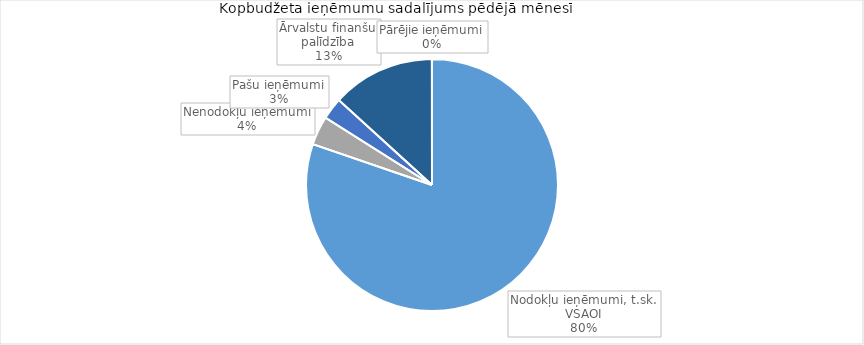
| Category | Series 0 |
|---|---|
| Nodokļu ieņēmumi, t.sk. VSAOI | 1107409.079 |
| Nenodokļu ieņēmumi | 51171.359 |
| Pašu ieņēmumi | 38661.189 |
| Ārvalstu finanšu palīdzība | 182517.174 |
| Pārējie ieņēmumi | -151.143 |